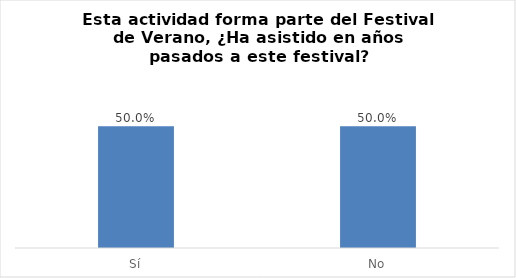
| Category | Series 0 |
|---|---|
| Sí | 0.5 |
| No | 0.5 |